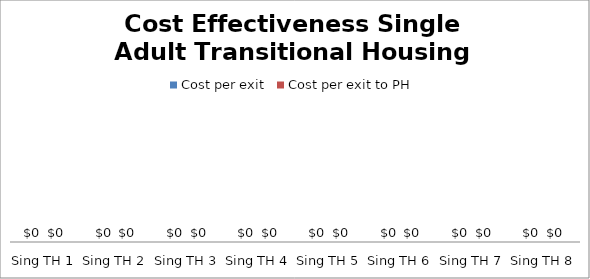
| Category | Cost per exit | Cost per exit to PH |
|---|---|---|
| Sing TH 1 | 0 | 0 |
| Sing TH 2 | 0 | 0 |
| Sing TH 3 | 0 | 0 |
| Sing TH 4 | 0 | 0 |
| Sing TH 5 | 0 | 0 |
| Sing TH 6 | 0 | 0 |
| Sing TH 7 | 0 | 0 |
| Sing TH 8 | 0 | 0 |